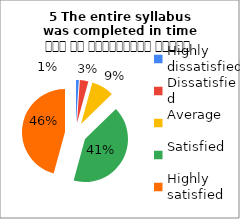
| Category | 5 The entire syllabus
was completed in time समय पर पाठ्यक्रम पूर्ण हुआ |
|---|---|
| Highly dissatisfied | 1 |
| Dissatisfied | 3 |
| Average | 8 |
| Satisfied | 39 |
| Highly satisfied | 43 |